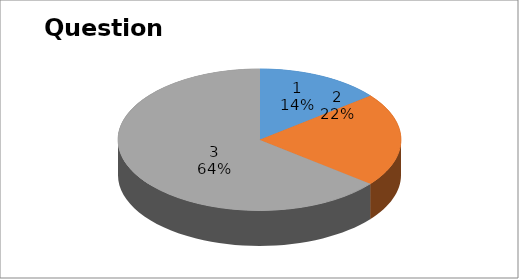
| Category | Series 0 |
|---|---|
| 0 | 6 |
| 1 | 9 |
| 2 | 27 |